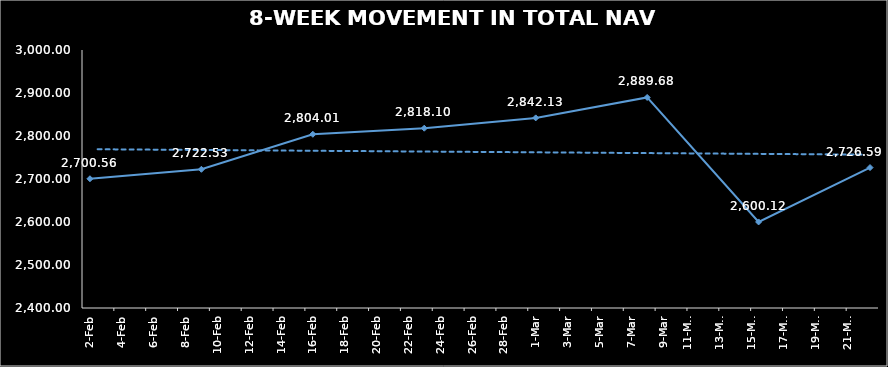
| Category | TOTAL NAV |
|---|---|
| 2024-02-02 | 2700.559 |
| 2024-02-09 | 2722.532 |
| 2024-02-16 | 2804.014 |
| 2024-02-23 | 2818.099 |
| 2024-03-01 | 2842.127 |
| 2024-03-08 | 2889.675 |
| 2024-03-15 | 2600.12 |
| 2024-03-22 | 2726.59 |